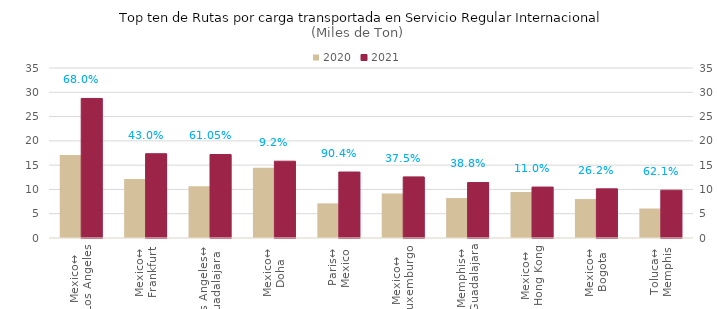
| Category | 2020 | 2021 |
|---|---|---|
| Mexico↔
Los Angeles | 17103.89 | 28728.11 |
| Mexico↔
Frankfurt | 12137.387 | 17352.226 |
| Los Angeles↔
Guadalajara | 10671.827 | 17186.75 |
| Mexico↔
Doha | 14478.446 | 15811.394 |
| Paris↔
Mexico | 7134.728 | 13584.849 |
| Mexico↔
Luxemburgo | 9154.473 | 12583.998 |
| Memphis↔
Guadalajara | 8226.845 | 11416.827 |
| Mexico↔
Hong Kong | 9449.311 | 10485.675 |
| Mexico↔
Bogota | 8018.299 | 10118.563 |
| Toluca↔
Memphis | 6072.329 | 9842.642 |